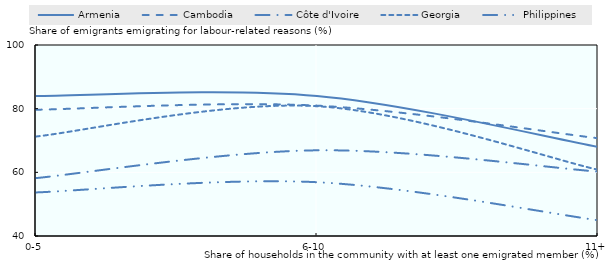
| Category | Armenia | Cambodia | Côte d'Ivoire | Georgia | Philippines |
|---|---|---|---|---|---|
| 0-5 | 84 | 79.668 | 58.182 | 71.25 | 53.682 |
| 6-10 | 84 | 80.952 | 66.923 | 80.769 | 56.897 |
| 11+ | 68 | 70.71 | 60.229 | 60.811 | 44.95 |